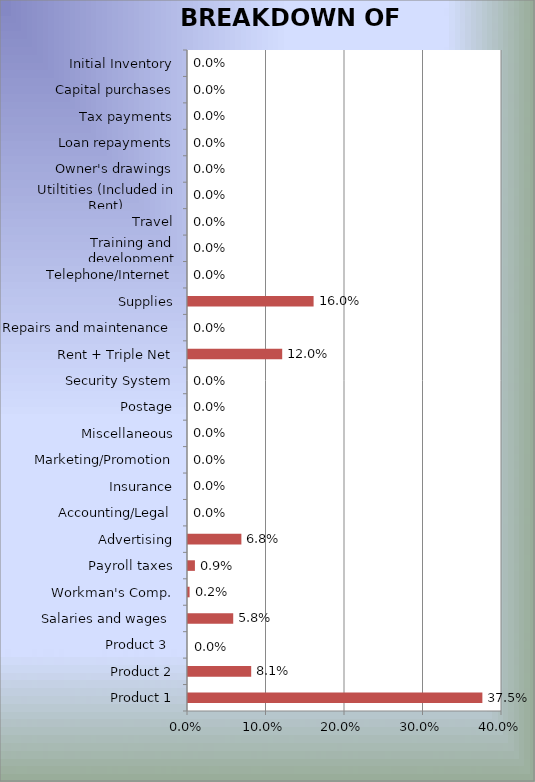
| Category | Series 0 |
|---|---|
| Product 1 | 0.375 |
| Product 2 | 0.08 |
| Product 3  | 0 |
| Salaries and wages  | 0.058 |
| Workman's Comp. | 0.002 |
| Payroll taxes | 0.009 |
| Advertising | 0.068 |
| Accounting/Legal | 0 |
| Insurance | 0 |
| Marketing/Promotion | 0 |
| Miscellaneous | 0 |
| Postage | 0 |
| Security System | 0 |
| Rent + Triple Net | 0.12 |
| Repairs and maintenance | 0 |
| Supplies | 0.16 |
| Telephone/Internet | 0 |
| Training and development | 0 |
| Travel | 0 |
| Utiltities (Included in Rent) | 0 |
| Owner's drawings | 0 |
| Loan repayments | 0 |
| Tax payments | 0 |
| Capital purchases | 0 |
| Initial Inventory | 0 |